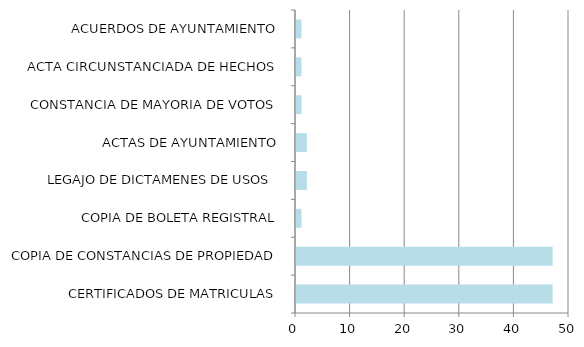
| Category | Series 0 |
|---|---|
| CERTIFICADOS DE MATRICULAS | 47 |
| COPIA DE CONSTANCIAS DE PROPIEDAD | 47 |
| COPIA DE BOLETA REGISTRAL | 1 |
| LEGAJO DE DICTAMENES DE USOS  | 2 |
| ACTAS DE AYUNTAMIENTO | 2 |
| CONSTANCIA DE MAYORIA DE VOTOS | 1 |
| ACTA CIRCUNSTANCIADA DE HECHOS | 1 |
| ACUERDOS DE AYUNTAMIENTO | 1 |